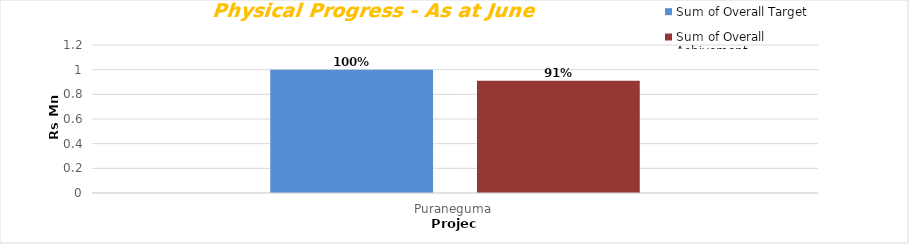
| Category | Sum of Overall Target | Sum of Overall Achivement |
|---|---|---|
| Puraneguma | 1 | 0.91 |